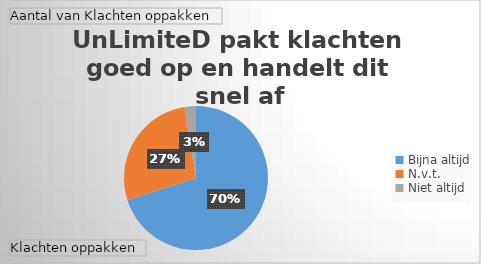
| Category | Totaal |
|---|---|
| Bijna altijd | 82 |
| N.v.t. | 32 |
| Niet altijd | 3 |